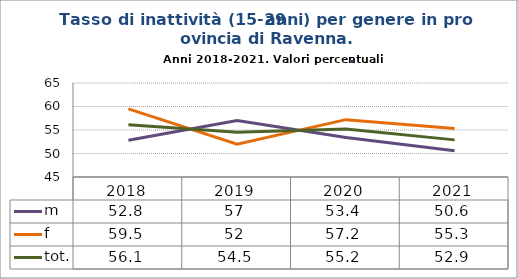
| Category | m | f | tot. |
|---|---|---|---|
| 2018.0 | 52.8 | 59.5 | 56.1 |
| 2019.0 | 57 | 52 | 54.5 |
| 2020.0 | 53.4 | 57.2 | 55.2 |
| 2021.0 | 50.6 | 55.3 | 52.9 |